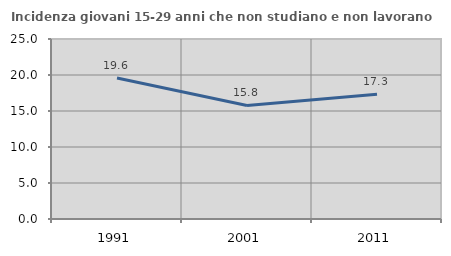
| Category | Incidenza giovani 15-29 anni che non studiano e non lavorano  |
|---|---|
| 1991.0 | 19.592 |
| 2001.0 | 15.774 |
| 2011.0 | 17.339 |